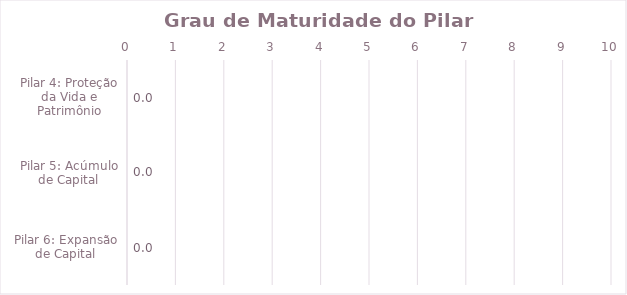
| Category | Series 0 |
|---|---|
| Pilar 4: Proteção da Vida e Patrimônio | 0 |
| Pilar 5: Acúmulo de Capital | 0 |
| Pilar 6: Expansão de Capital | 0 |